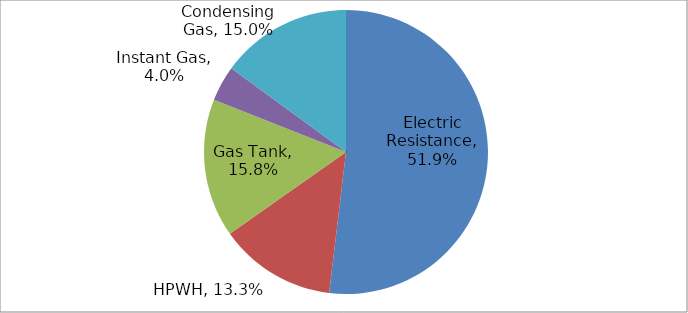
| Category | Series 0 |
|---|---|
| Electric Resistance | 0.519 |
| HPWH | 0.133 |
| Gas Tank | 0.158 |
| Instant Gas | 0.04 |
| Condensing Gas | 0.15 |